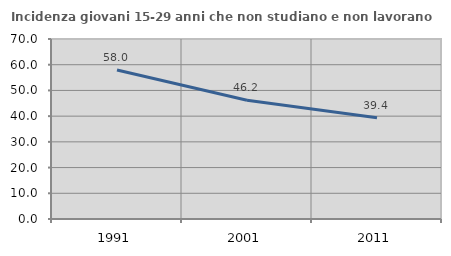
| Category | Incidenza giovani 15-29 anni che non studiano e non lavorano  |
|---|---|
| 1991.0 | 57.965 |
| 2001.0 | 46.211 |
| 2011.0 | 39.4 |